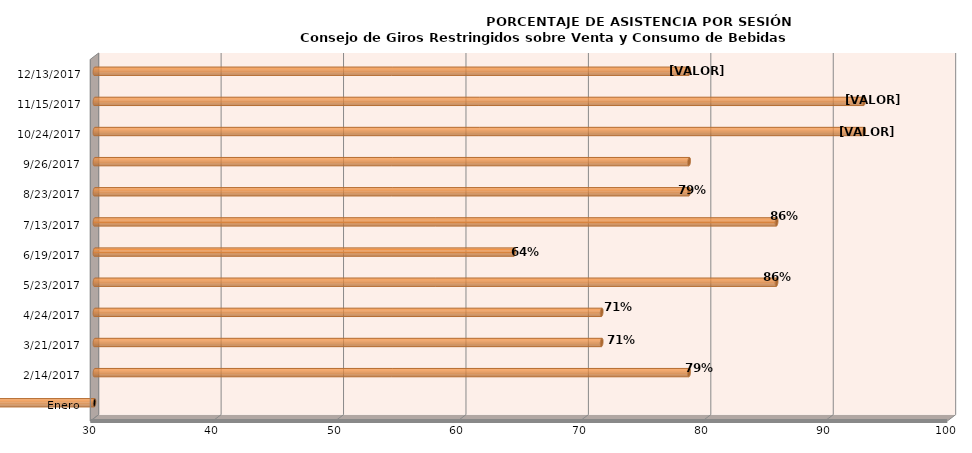
| Category | Series 0 |
|---|---|
| Enero | 0 |
| 14/02/2017 | 78.571 |
| 21/03/2017 | 71.429 |
| 24/04/2017 | 71.429 |
| 23/05/2017 | 85.714 |
| 19/06/2017 | 64.286 |
| 13/07/2017 | 85.714 |
| 23/08/2017 | 78.571 |
| 26/09/2017 | 78.571 |
| 24/10/2017 | 92.857 |
| 15/11/2017 | 92.857 |
| 13/12/2017 | 78.571 |